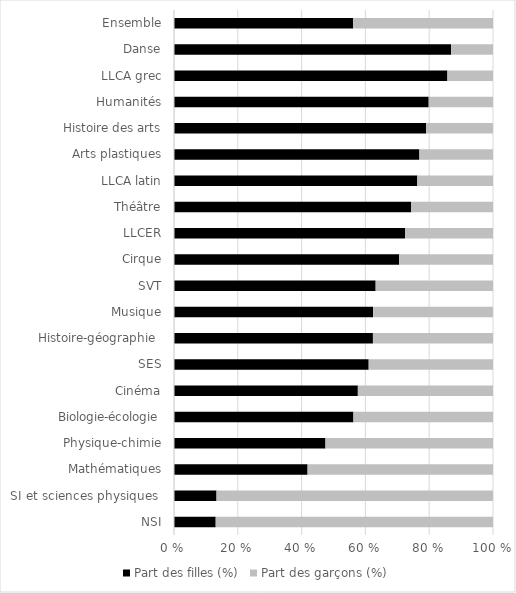
| Category | Part des filles (%) | Part des garçons (%) |
|---|---|---|
| NSI | 13.073 | 86.927 |
| SI et sciences physiques  | 13.335 | 86.665 |
| Mathématiques | 41.875 | 58.125 |
| Physique-chimie | 47.482 | 52.518 |
| Biologie-écologie | 56.25 | 43.75 |
| Cinéma | 57.632 | 42.368 |
| SES | 61.033 | 38.967 |
| Histoire-géographie  | 62.361 | 37.639 |
| Musique | 62.395 | 37.605 |
| SVT | 63.216 | 36.784 |
| Cirque | 70.588 | 29.412 |
| LLCER | 72.432 | 27.568 |
| Théâtre | 74.36 | 25.64 |
| LLCA latin | 76.284 | 23.716 |
| Arts plastiques | 76.929 | 23.071 |
| Histoire des arts | 79.034 | 20.966 |
| Humanités | 79.844 | 20.156 |
| LLCA grec | 85.714 | 14.286 |
| Danse | 86.869 | 13.131 |
| Ensemble | 56.112 | 43.888 |